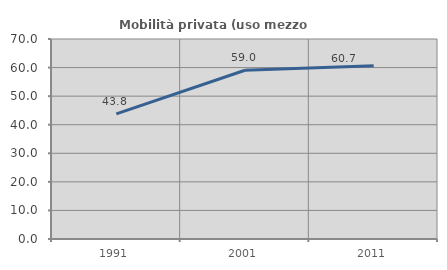
| Category | Mobilità privata (uso mezzo privato) |
|---|---|
| 1991.0 | 43.788 |
| 2001.0 | 59.048 |
| 2011.0 | 60.676 |